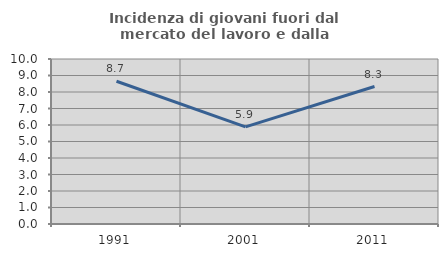
| Category | Incidenza di giovani fuori dal mercato del lavoro e dalla formazione  |
|---|---|
| 1991.0 | 8.654 |
| 2001.0 | 5.89 |
| 2011.0 | 8.333 |